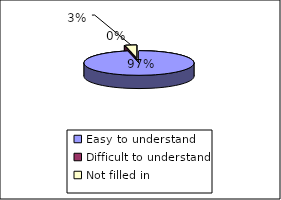
| Category | If yes to the previous question was the information |
|---|---|
| Easy to understand | 59 |
| Difficult to understand | 0 |
| Not filled in  | 2 |